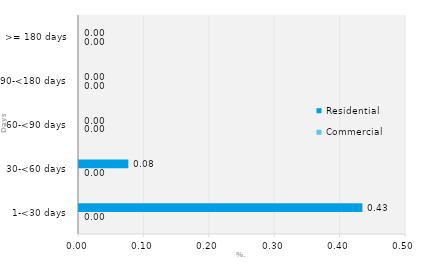
| Category | Commercial | Residential |
|---|---|---|
| 1-<30 days | 0 | 0.433 |
| 30-<60 days | 0 | 0.075 |
| 60-<90 days | 0 | 0 |
| 90-<180 days | 0 | 0 |
| >= 180 days | 0 | 0 |